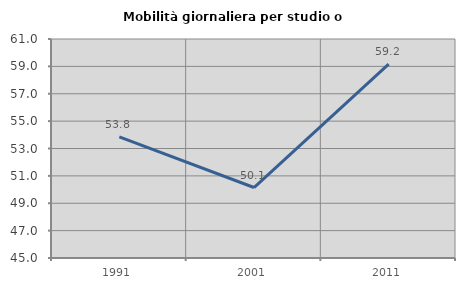
| Category | Mobilità giornaliera per studio o lavoro |
|---|---|
| 1991.0 | 53.846 |
| 2001.0 | 50.149 |
| 2011.0 | 59.164 |